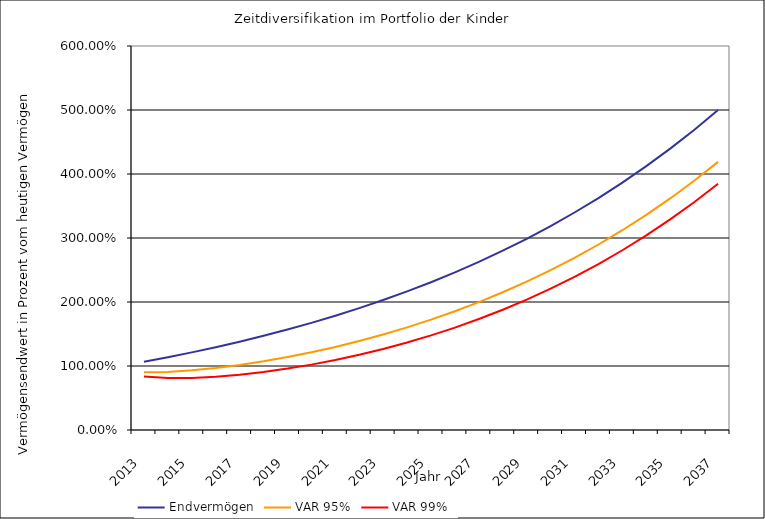
| Category | Endvermögen | VAR 95% | VAR 99% |
|---|---|---|---|
| 2013.0 | 1.066 | 0.904 | 0.836 |
| 2014.0 | 1.137 | 0.908 | 0.811 |
| 2015.0 | 1.213 | 0.932 | 0.814 |
| 2016.0 | 1.294 | 0.969 | 0.833 |
| 2017.0 | 1.38 | 1.017 | 0.864 |
| 2018.0 | 1.472 | 1.074 | 0.907 |
| 2019.0 | 1.569 | 1.14 | 0.959 |
| 2020.0 | 1.674 | 1.215 | 1.022 |
| 2021.0 | 1.785 | 1.298 | 1.093 |
| 2022.0 | 1.904 | 1.391 | 1.175 |
| 2023.0 | 2.03 | 1.492 | 1.266 |
| 2024.0 | 2.165 | 1.603 | 1.367 |
| 2025.0 | 2.309 | 1.724 | 1.478 |
| 2026.0 | 2.463 | 1.856 | 1.6 |
| 2027.0 | 2.627 | 1.998 | 1.734 |
| 2028.0 | 2.801 | 2.152 | 1.879 |
| 2029.0 | 2.988 | 2.319 | 2.037 |
| 2030.0 | 3.186 | 2.498 | 2.208 |
| 2031.0 | 3.398 | 2.691 | 2.393 |
| 2032.0 | 3.624 | 2.898 | 2.593 |
| 2033.0 | 3.865 | 3.122 | 2.809 |
| 2034.0 | 4.122 | 3.361 | 3.041 |
| 2035.0 | 4.396 | 3.618 | 3.291 |
| 2036.0 | 4.689 | 3.894 | 3.559 |
| 2037.0 | 5.001 | 4.189 | 3.848 |